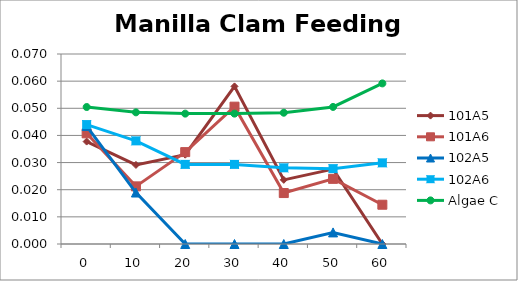
| Category | 101A5 | 101A6 | 102A5 | 102A6 | Algae C |
|---|---|---|---|---|---|
| 0.0 | 0.038 | 0.041 | 0.043 | 0.044 | 0.05 |
| 10.0 | 0.029 | 0.021 | 0.019 | 0.038 | 0.048 |
| 20.0 | 0.033 | 0.034 | 0 | 0.029 | 0.048 |
| 30.0 | 0.058 | 0.051 | 0 | 0.029 | 0.048 |
| 40.0 | 0.024 | 0.019 | 0 | 0.028 | 0.048 |
| 50.0 | 0.028 | 0.024 | 0.004 | 0.028 | 0.05 |
| 60.0 | 0 | 0.014 | 0 | 0.03 | 0.059 |